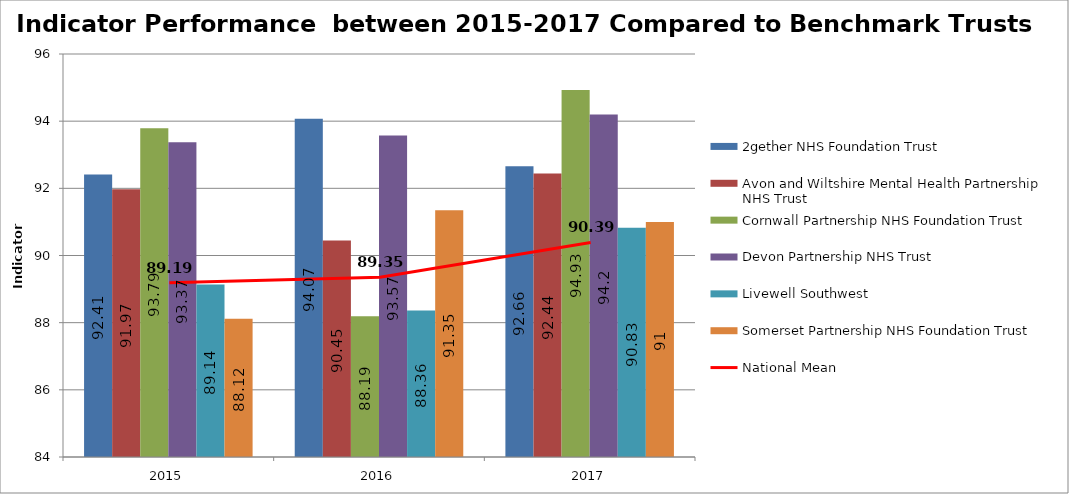
| Category | 2gether NHS Foundation Trust | Avon and Wiltshire Mental Health Partnership NHS Trust | Cornwall Partnership NHS Foundation Trust | Devon Partnership NHS Trust | Livewell Southwest | Somerset Partnership NHS Foundation Trust |
|---|---|---|---|---|---|---|
| 2015 | 92.41 | 91.97 | 93.79 | 93.37 | 89.14 | 88.12 |
| 2016 | 94.07 | 90.45 | 88.19 | 93.57 | 88.36 | 91.35 |
| 2017 | 92.66 | 92.44 | 94.93 | 94.2 | 90.83 | 91 |